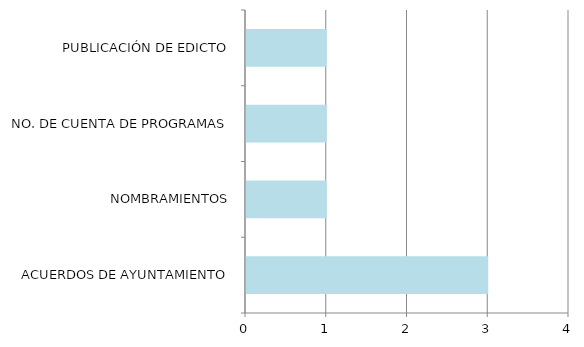
| Category | Series 0 |
|---|---|
| ACUERDOS DE AYUNTAMIENTO | 3 |
| NOMBRAMIENTOS | 1 |
| NO. DE CUENTA DE PROGRAMAS | 1 |
| PUBLICACIÓN DE EDICTO | 1 |